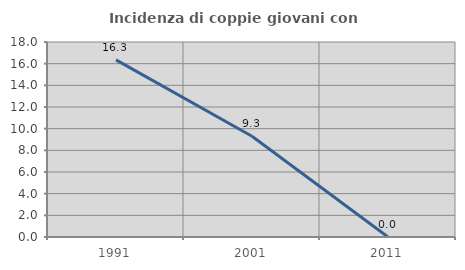
| Category | Incidenza di coppie giovani con figli |
|---|---|
| 1991.0 | 16.346 |
| 2001.0 | 9.302 |
| 2011.0 | 0 |